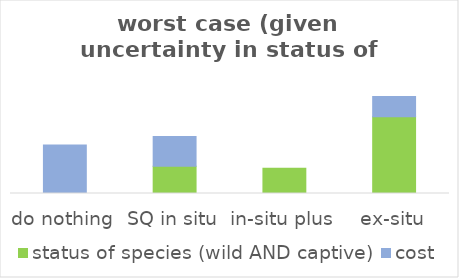
| Category | status of species (wild AND captive) | cost |
|---|---|---|
| do nothing | 0 | 0.2 |
| SQ in situ | 0.113 | 0.123 |
| in-situ plus | 0.104 | 0 |
| ex-situ | 0.317 | 0.084 |